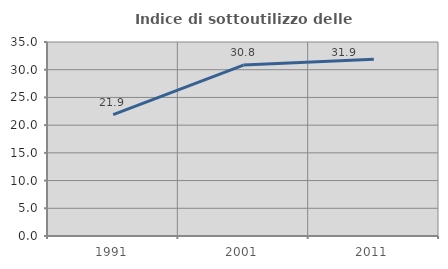
| Category | Indice di sottoutilizzo delle abitazioni  |
|---|---|
| 1991.0 | 21.911 |
| 2001.0 | 30.83 |
| 2011.0 | 31.891 |